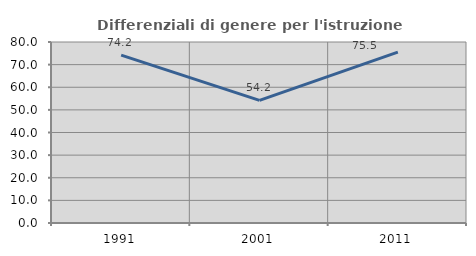
| Category | Differenziali di genere per l'istruzione superiore |
|---|---|
| 1991.0 | 74.182 |
| 2001.0 | 54.167 |
| 2011.0 | 75.519 |